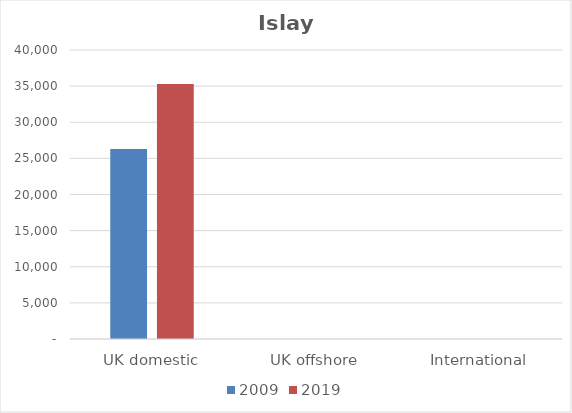
| Category | 2009 | 2019 |
|---|---|---|
| UK domestic | 26282 | 35296 |
| UK offshore | 0 | 0 |
| International | 0 | 0 |